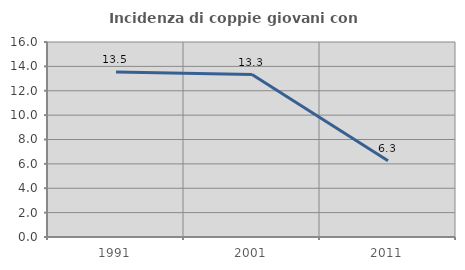
| Category | Incidenza di coppie giovani con figli |
|---|---|
| 1991.0 | 13.548 |
| 2001.0 | 13.333 |
| 2011.0 | 6.25 |